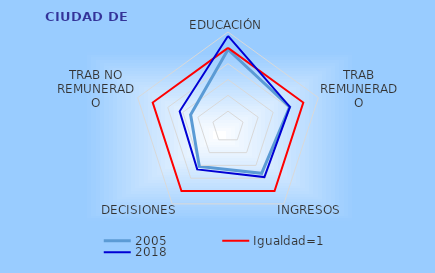
| Category | 2005 | Igualdad=1 | 2018 |
|---|---|---|---|
| EDUCACIÓN | 0.979 | 1 | 1.15 |
| TRAB REMUNERADO | 0.818 | 1 | 0.822 |
| INGRESOS | 0.723 | 1 | 0.782 |
| DECISIONES | 0.616 | 1 | 0.662 |
| TRAB NO REMUNERADO | 0.496 | 1 | 0.642 |